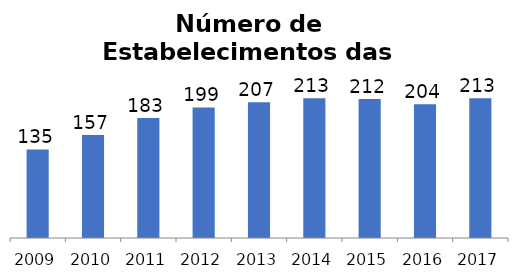
| Category | Total |
|---|---|
| 2009.0 | 135 |
| 2010.0 | 157 |
| 2011.0 | 183 |
| 2012.0 | 199 |
| 2013.0 | 207 |
| 2014.0 | 213 |
| 2015.0 | 212 |
| 2016.0 | 204 |
| 2017.0 | 213 |